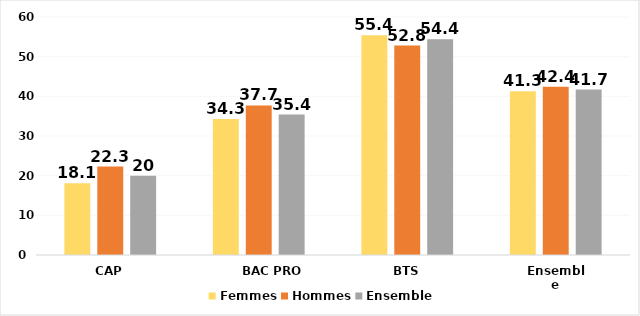
| Category | Femmes | Hommes | Ensemble |
|---|---|---|---|
| CAP | 18.1 | 22.3 | 20 |
| BAC PRO | 34.3 | 37.7 | 35.4 |
| BTS | 55.4 | 52.8 | 54.4 |
| Ensemble | 41.3 | 42.4 | 41.7 |